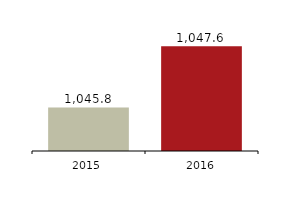
| Category | Total Assets |
|---|---|
| 2016.0 | 1047554 |
| 2015.0 | 1045769 |